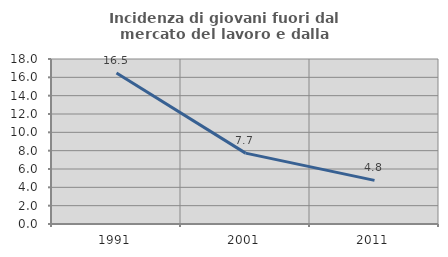
| Category | Incidenza di giovani fuori dal mercato del lavoro e dalla formazione  |
|---|---|
| 1991.0 | 16.463 |
| 2001.0 | 7.732 |
| 2011.0 | 4.762 |